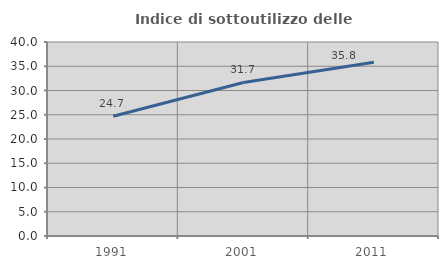
| Category | Indice di sottoutilizzo delle abitazioni  |
|---|---|
| 1991.0 | 24.684 |
| 2001.0 | 31.657 |
| 2011.0 | 35.84 |